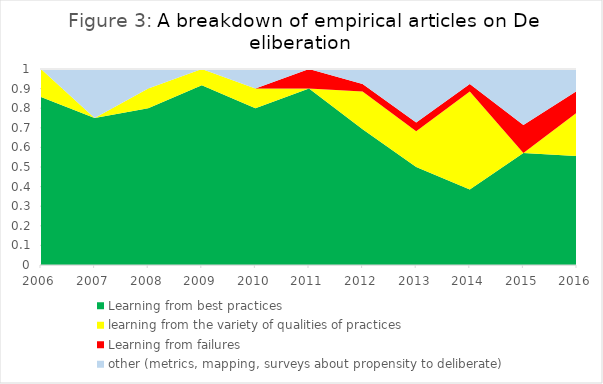
| Category | Learning from best practices | learning from the variety of qualities of practices | Learning from failures | other (metrics, mapping, surveys about propensity to deliberate) |
|---|---|---|---|---|
| 2006.0 | 0.857 | 0.143 | 0 | 0 |
| 2007.0 | 0.75 | 0 | 0 | 0.25 |
| 2008.0 | 0.8 | 0.1 | 0 | 0.1 |
| 2009.0 | 0.917 | 0.083 | 0 | 0 |
| 2010.0 | 0.8 | 0.1 | 0 | 0.1 |
| 2011.0 | 0.9 | 0 | 0.1 | 0 |
| 2012.0 | 0.692 | 0.192 | 0.038 | 0.077 |
| 2013.0 | 0.5 | 0.182 | 0.045 | 0.273 |
| 2014.0 | 0.385 | 0.5 | 0.038 | 0.077 |
| 2015.0 | 0.571 | 0 | 0.143 | 0.286 |
| 2016.0 | 0.556 | 0.222 | 0.111 | 0.111 |